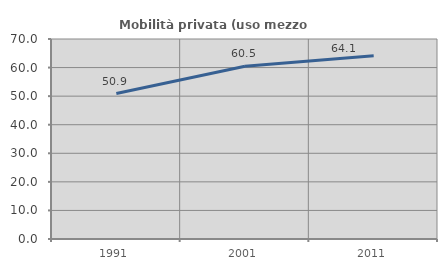
| Category | Mobilità privata (uso mezzo privato) |
|---|---|
| 1991.0 | 50.897 |
| 2001.0 | 60.469 |
| 2011.0 | 64.108 |